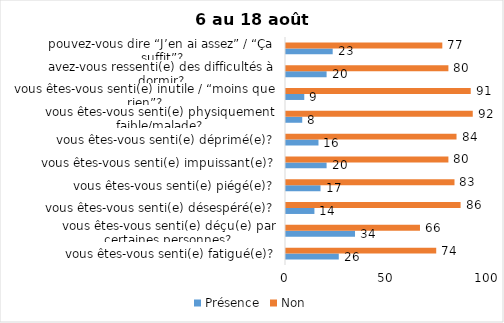
| Category | Présence | Non |
|---|---|---|
| vous êtes-vous senti(e) fatigué(e)? | 26 | 74 |
| vous êtes-vous senti(e) déçu(e) par certaines personnes? | 34 | 66 |
| vous êtes-vous senti(e) désespéré(e)? | 14 | 86 |
| vous êtes-vous senti(e) piégé(e)? | 17 | 83 |
| vous êtes-vous senti(e) impuissant(e)? | 20 | 80 |
| vous êtes-vous senti(e) déprimé(e)? | 16 | 84 |
| vous êtes-vous senti(e) physiquement faible/malade? | 8 | 92 |
| vous êtes-vous senti(e) inutile / “moins que rien”? | 9 | 91 |
| avez-vous ressenti(e) des difficultés à dormir? | 20 | 80 |
| pouvez-vous dire “J’en ai assez” / “Ça suffit”? | 23 | 77 |